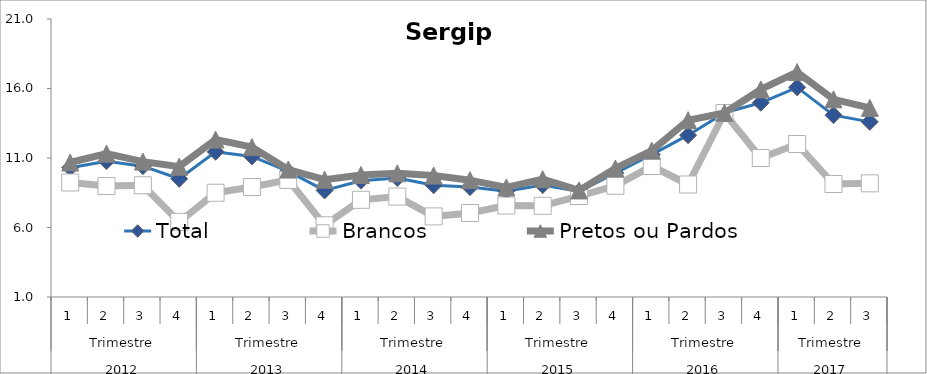
| Category | Total | Brancos | Pretos ou Pardos |
|---|---|---|---|
| 0 | 10.305 | 9.239 | 10.675 |
| 1 | 10.771 | 8.982 | 11.314 |
| 2 | 10.412 | 9.039 | 10.741 |
| 3 | 9.505 | 6.404 | 10.377 |
| 4 | 11.447 | 8.5 | 12.324 |
| 5 | 11.111 | 8.912 | 11.78 |
| 6 | 10.033 | 9.424 | 10.168 |
| 7 | 8.665 | 6.157 | 9.44 |
| 8 | 9.368 | 7.991 | 9.778 |
| 9 | 9.557 | 8.224 | 9.897 |
| 10 | 9.038 | 6.799 | 9.736 |
| 11 | 8.906 | 7.042 | 9.406 |
| 12 | 8.612 | 7.576 | 8.883 |
| 13 | 9.052 | 7.56 | 9.474 |
| 14 | 8.589 | 8.264 | 8.665 |
| 15 | 9.916 | 9.004 | 10.249 |
| 16 | 11.247 | 10.42 | 11.527 |
| 17 | 12.641 | 9.094 | 13.718 |
| 18 | 14.242 | 14.235 | 14.249 |
| 19 | 14.973 | 10.996 | 15.933 |
| 20 | 16.081 | 12.006 | 17.18 |
| 21 | 14.082 | 9.13 | 15.221 |
| 22 | 13.599 | 9.177 | 14.608 |